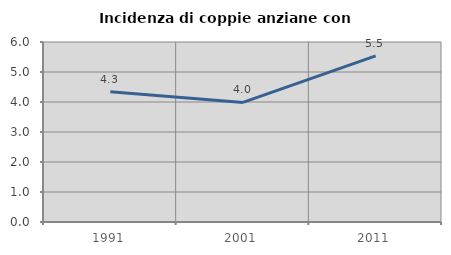
| Category | Incidenza di coppie anziane con figli |
|---|---|
| 1991.0 | 4.339 |
| 2001.0 | 3.985 |
| 2011.0 | 5.535 |